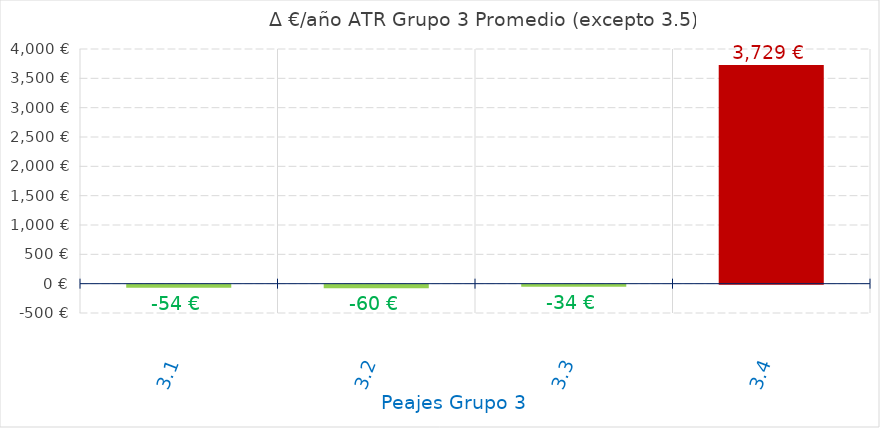
| Category | D €/año |
|---|---|
| 3.1 | -53.694 |
| 3.2 | -59.589 |
| 3.3 | -33.827 |
| 3.4 | 3728.894 |